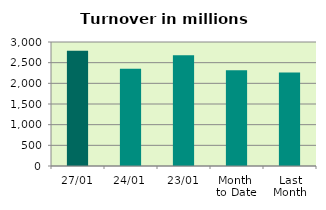
| Category | Series 0 |
|---|---|
| 27/01 | 2790.042 |
| 24/01 | 2350.554 |
| 23/01 | 2678.64 |
| Month 
to Date | 2317.384 |
| Last
Month | 2262.611 |